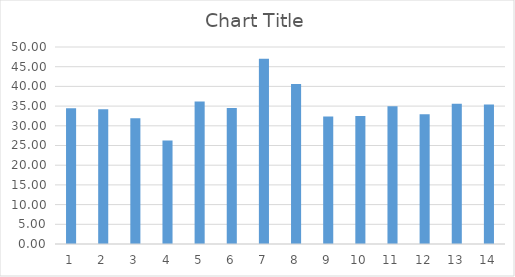
| Category | Series 0 |
|---|---|
| 0 | 34.454 |
| 1 | 34.215 |
| 2 | 31.907 |
| 3 | 26.267 |
| 4 | 36.152 |
| 5 | 34.521 |
| 6 | 46.993 |
| 7 | 40.578 |
| 8 | 32.367 |
| 9 | 32.473 |
| 10 | 34.953 |
| 11 | 32.955 |
| 12 | 35.568 |
| 13 | 35.403 |